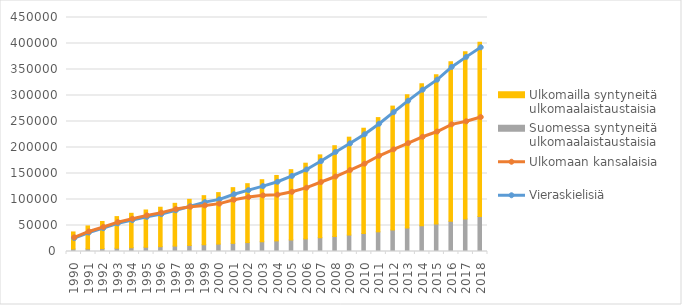
| Category | Suomessa syntyneitä ulkomaalaistaustaisia  | Ulkomailla syntyneitä ulkomaalaistaustaisia  |
|---|---|---|
| 1990 | 4814 | 32804 |
| 1991 | 5138 | 44027 |
| 1992 | 5566 | 52127 |
| 1993 | 6306 | 60819 |
| 1994 | 7222 | 66241 |
| 1995 | 8217 | 71633 |
| 1996 | 9243 | 75877 |
| 1997 | 10394 | 82227 |
| 1998 | 11623 | 88695 |
| 1999 | 12985 | 94410 |
| 2000 | 14268 | 98977 |
| 2001 | 15664 | 107140 |
| 2002 | 17128 | 113298 |
| 2003 | 18730 | 119309 |
| 2004 | 20374 | 125850 |
| 2005 | 22216 | 135143 |
| 2006 | 24224 | 145584 |
| 2007 | 26463 | 159346 |
| 2008 | 28898 | 174543 |
| 2009 | 31606 | 188249 |
| 2010 | 34623 | 202443 |
| 2011 | 37828 | 219666 |
| 2012 | 41408 | 238208 |
| 2013 | 45283 | 256241 |
| 2014 | 49405 | 273306 |
| 2015 | 53122 | 286803 |
| 2016 | 57947 | 306840 |
| 2017 | 62629 | 321494 |
| 2018 | 67205 | 335414 |